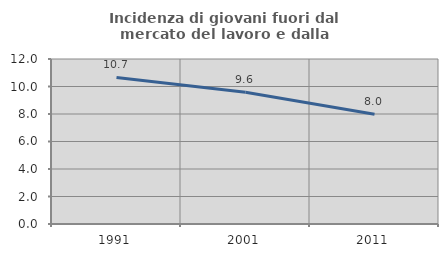
| Category | Incidenza di giovani fuori dal mercato del lavoro e dalla formazione  |
|---|---|
| 1991.0 | 10.658 |
| 2001.0 | 9.574 |
| 2011.0 | 7.983 |